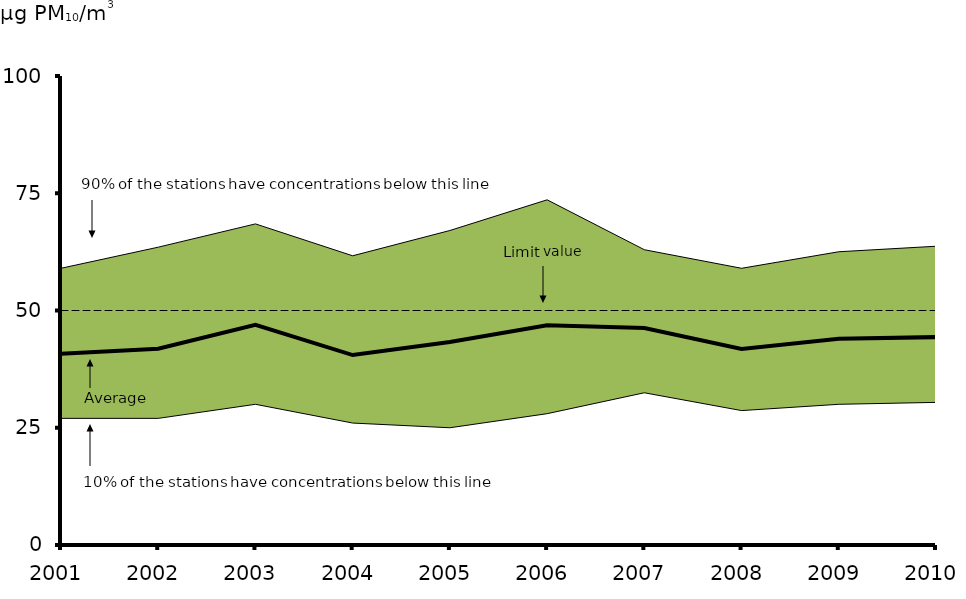
| Category | Average | Limit value |
|---|---|---|
| 2001.0 | 40.78 | 50 |
| 2002.0 | 41.835 | 50 |
| 2003.0 | 46.954 | 50 |
| 2004.0 | 40.494 | 50 |
| 2005.0 | 43.267 | 50 |
| 2006.0 | 46.868 | 50 |
| 2007.0 | 46.272 | 50 |
| 2008.0 | 41.78 | 50 |
| 2009.0 | 43.95 | 50 |
| 2010.0 | 44.327 | 50 |